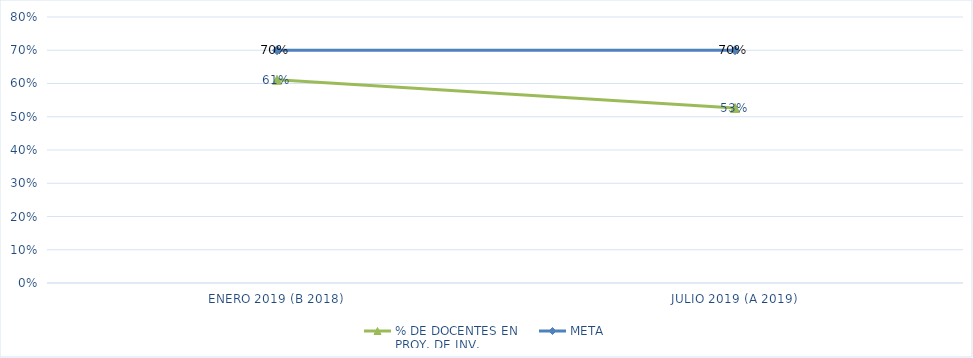
| Category | % DE DOCENTES EN 
PROY. DE INV. | META |
|---|---|---|
| ENERO 2019 (B 2018) | 0.611 | 0.7 |
| JULIO 2019 (A 2019) | 0.526 | 0.7 |